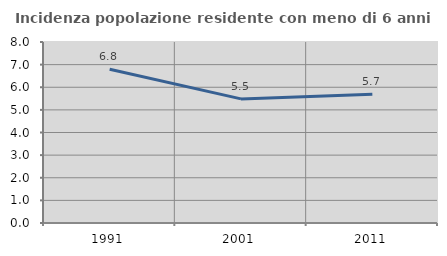
| Category | Incidenza popolazione residente con meno di 6 anni |
|---|---|
| 1991.0 | 6.794 |
| 2001.0 | 5.486 |
| 2011.0 | 5.688 |